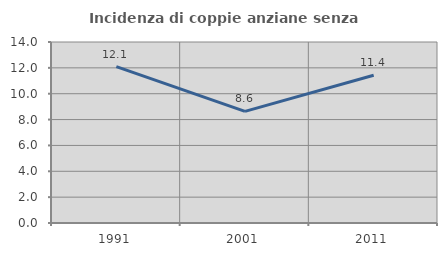
| Category | Incidenza di coppie anziane senza figli  |
|---|---|
| 1991.0 | 12.097 |
| 2001.0 | 8.633 |
| 2011.0 | 11.429 |